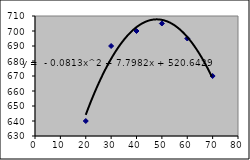
| Category | Series 0 |
|---|---|
| 20.0 | 640 |
| 30.0 | 690 |
| 40.0 | 700 |
| 50.0 | 705 |
| 60.0 | 695 |
| 70.0 | 670 |